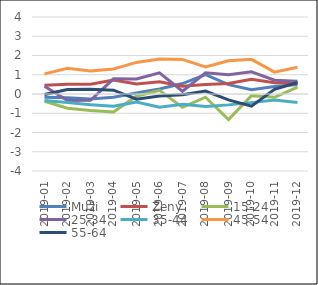
| Category | Muži | Ženy | 15-24 | 25-34 | 35-44 | 45-54 | 55-64 |
|---|---|---|---|---|---|---|---|
| 2019-01 | -0.174 | 0.451 | -0.38 | 0.398 | -0.342 | 1.046 | -0.022 |
| 2019-02 | -0.19 | 0.508 | -0.741 | -0.336 | -0.444 | 1.331 | 0.228 |
| 2019-03 | -0.264 | 0.505 | -0.854 | -0.326 | -0.554 | 1.194 | 0.249 |
| 2019-04 | -0.166 | 0.732 | -0.938 | 0.789 | -0.64 | 1.297 | 0.199 |
| 2019-05 | 0.054 | 0.523 | -0.117 | 0.777 | -0.416 | 1.641 | -0.271 |
| 2019-06 | 0.259 | 0.638 | 0.189 | 1.096 | -0.682 | 1.82 | -0.098 |
| 2019-07 | 0.541 | 0.408 | -0.694 | 0.144 | -0.53 | 1.797 | -0.037 |
| 2019-08 | 1.004 | 0.498 | -0.165 | 1.102 | -0.644 | 1.409 | 0.157 |
| 2019-09 | 0.484 | 0.542 | -1.326 | 1.005 | -0.565 | 1.728 | -0.308 |
| 2019-10 | 0.224 | 0.768 | -0.085 | 1.149 | -0.448 | 1.801 | -0.631 |
| 2019-11 | 0.389 | 0.582 | -0.174 | 0.715 | -0.318 | 1.137 | 0.246 |
| 2019-12 | 0.494 | 0.567 | 0.358 | 0.661 | -0.446 | 1.387 | 0.599 |